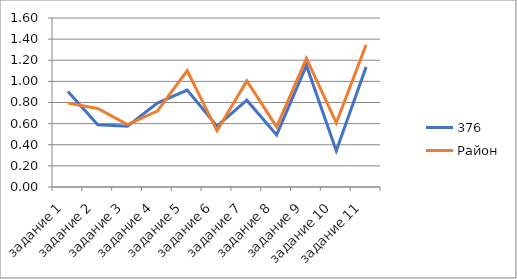
| Category | 376 | Район |
|---|---|---|
| задание 1 | 0.904 | 0.794 |
| задание 2 | 0.589 | 0.743 |
| задание 3 | 0.575 | 0.59 |
| задание 4 | 0.795 | 0.719 |
| задание 5 | 0.918 | 1.101 |
| задание 6 | 0.575 | 0.533 |
| задание 7 | 0.822 | 1.005 |
| задание 8 | 0.493 | 0.569 |
| задание 9 | 1.151 | 1.217 |
| задание 10 | 0.342 | 0.606 |
| задание 11 | 1.137 | 1.346 |